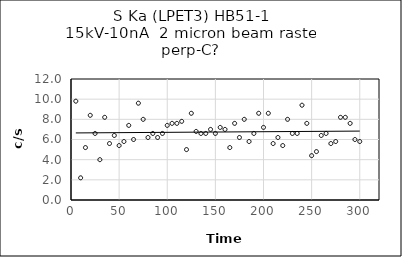
| Category | Series 0 |
|---|---|
| 5.0 | 9.8 |
| 10.0 | 2.2 |
| 15.0 | 5.2 |
| 20.0 | 8.4 |
| 25.0 | 6.6 |
| 30.0 | 4 |
| 35.0 | 8.2 |
| 40.0 | 5.6 |
| 45.0 | 6.4 |
| 50.0 | 5.4 |
| 55.0 | 5.8 |
| 60.0 | 7.4 |
| 65.0 | 6 |
| 70.0 | 9.6 |
| 75.0 | 8 |
| 80.0 | 6.2 |
| 85.0 | 6.6 |
| 90.0 | 6.2 |
| 95.0 | 6.6 |
| 100.0 | 7.4 |
| 105.0 | 7.6 |
| 110.0 | 7.6 |
| 115.0 | 7.8 |
| 120.0 | 5 |
| 125.0 | 8.6 |
| 130.0 | 6.8 |
| 135.0 | 6.6 |
| 140.0 | 6.6 |
| 145.0 | 7 |
| 150.0 | 6.6 |
| 155.0 | 7.2 |
| 160.0 | 7 |
| 165.0 | 5.2 |
| 170.0 | 7.6 |
| 175.0 | 6.2 |
| 180.0 | 8 |
| 185.0 | 5.8 |
| 190.0 | 6.6 |
| 195.0 | 8.6 |
| 200.0 | 7.2 |
| 205.0 | 8.6 |
| 210.0 | 5.6 |
| 215.0 | 6.2 |
| 220.0 | 5.4 |
| 225.0 | 8 |
| 230.0 | 6.6 |
| 235.0 | 6.6 |
| 240.0 | 9.4 |
| 245.0 | 7.6 |
| 250.0 | 4.4 |
| 255.0 | 4.8 |
| 260.0 | 6.4 |
| 265.0 | 6.6 |
| 270.0 | 5.6 |
| 275.0 | 5.8 |
| 280.0 | 8.2 |
| 285.0 | 8.2 |
| 290.0 | 7.6 |
| 295.0 | 6 |
| 300.0 | 5.8 |